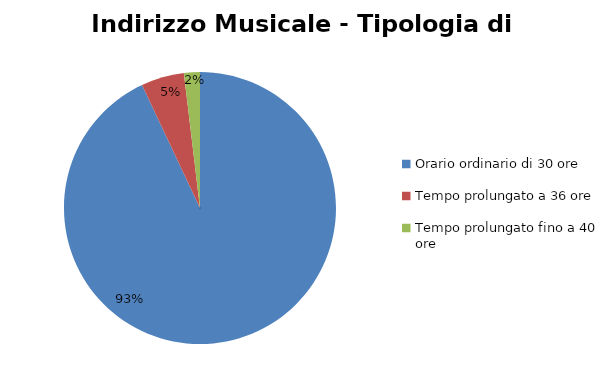
| Category | Series 0 | Series 1 |
|---|---|---|
| Orario ordinario di 30 ore | 2454 |  |
| Tempo prolungato a 36 ore | 135 |  |
| Tempo prolungato fino a 40 ore | 50 |  |